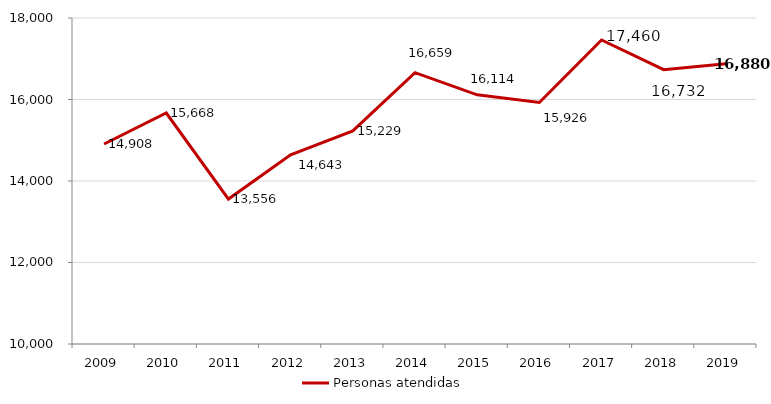
| Category | Personas atendidas |
|---|---|
| 2009.0 | 14908 |
| 2010.0 | 15668 |
| 2011.0 | 13556 |
| 2012.0 | 14643 |
| 2013.0 | 15229 |
| 2014.0 | 16659 |
| 2015.0 | 16114 |
| 2016.0 | 15926 |
| 2017.0 | 17460 |
| 2018.0 | 16732 |
| 2019.0 | 16880 |